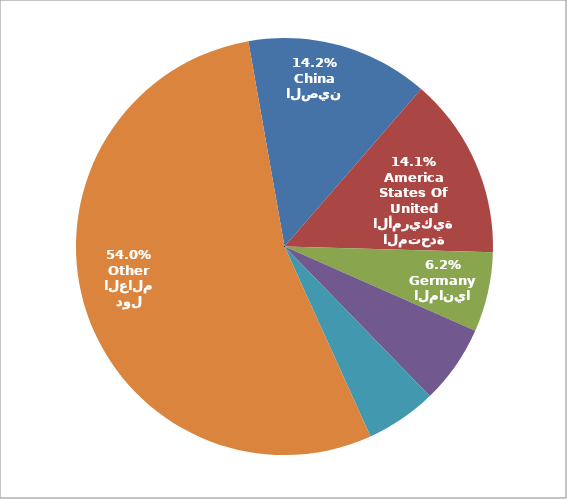
| Category | Series 0 |
|---|---|
| الصين
China | 3448 |
| الولا يات المتحدة الأمريكية
United States Of America | 3422 |
| المانيا
Germany | 1506 |
| الهند
India | 1490 |
| إيطاليا
Italy | 1338 |
| بقية دول العالم
Other | 13149.518 |